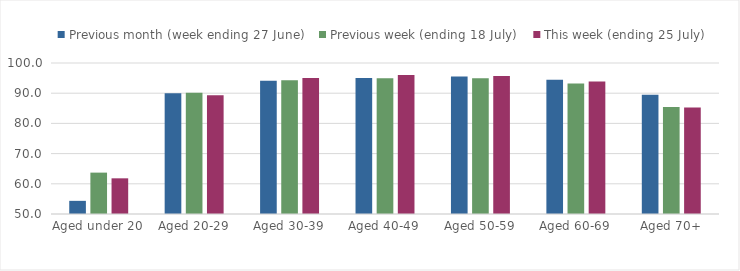
| Category | Previous month (week ending 27 June) | Previous week (ending 18 July) | This week (ending 25 July) |
|---|---|---|---|
| Aged under 20 | 54.355 | 63.703 | 61.814 |
| Aged 20-29 | 89.964 | 90.185 | 89.337 |
| Aged 30-39 | 94.135 | 94.298 | 95.035 |
| Aged 40-49 | 95.045 | 94.96 | 96.033 |
| Aged 50-59 | 95.521 | 94.983 | 95.729 |
| Aged 60-69 | 94.421 | 93.192 | 93.881 |
| Aged 70+ | 89.525 | 85.421 | 85.257 |